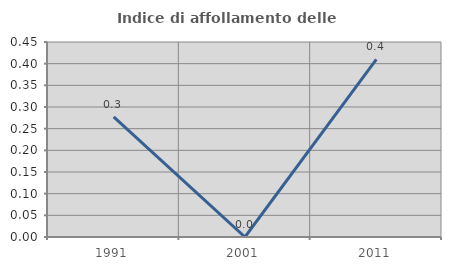
| Category | Indice di affollamento delle abitazioni  |
|---|---|
| 1991.0 | 0.277 |
| 2001.0 | 0 |
| 2011.0 | 0.41 |